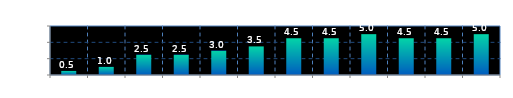
| Category | Series 0 |
|---|---|
| 0 | 0.5 |
| 1 | 1 |
| 2 | 2.5 |
| 3 | 2.5 |
| 4 | 3 |
| 5 | 3.5 |
| 6 | 4.5 |
| 7 | 4.5 |
| 8 | 5 |
| 9 | 4.5 |
| 10 | 4.5 |
| 11 | 5 |